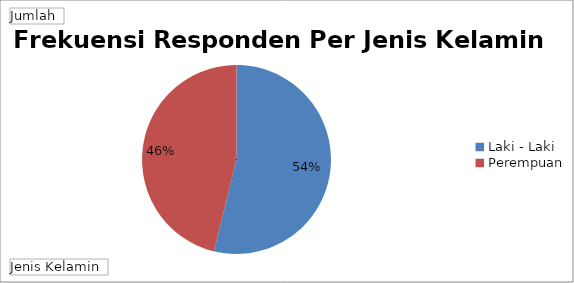
| Category | Total |
|---|---|
| Laki - Laki | 42 |
| Perempuan | 36 |